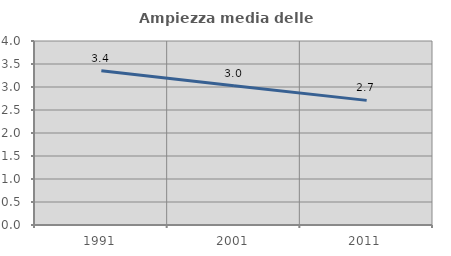
| Category | Ampiezza media delle famiglie |
|---|---|
| 1991.0 | 3.352 |
| 2001.0 | 3.029 |
| 2011.0 | 2.709 |